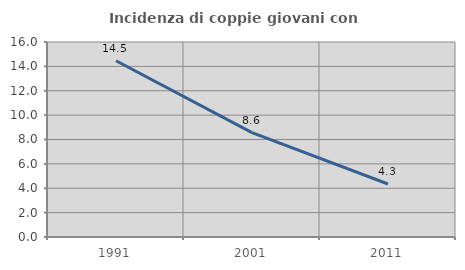
| Category | Incidenza di coppie giovani con figli |
|---|---|
| 1991.0 | 14.458 |
| 2001.0 | 8.559 |
| 2011.0 | 4.348 |